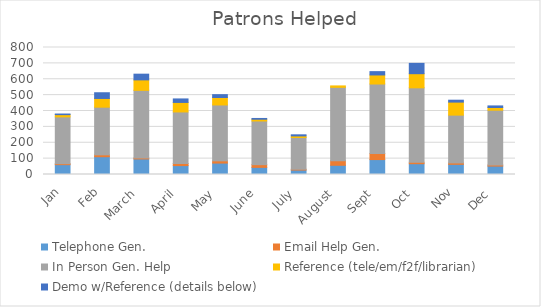
| Category | Telephone Gen. | Email Help Gen. | In Person Gen. Help | Reference (tele/em/f2f/librarian) | Demo w/Reference (details below)  |
|---|---|---|---|---|---|
| Jan | 62 | 6 | 295 | 14 | 4 |
| Feb | 112 | 12 | 300 | 55 | 36 |
| March  | 98 | 6 | 426 | 66 | 36 |
| April  | 56 | 13 | 325 | 60 | 22 |
| May  | 72 | 14 | 352 | 47 | 18 |
| June  | 45 | 17 | 275 | 11 | 5 |
| July  | 28 | 5 | 200 | 10 | 7 |
| August  | 58 | 29 | 462 | 9 | 0 |
| Sept  | 94 | 38 | 438 | 57 | 21 |
| Oct  | 68 | 9 | 469 | 89 | 65 |
| Nov | 64 | 9 | 301 | 82 | 12 |
| Dec  | 53 | 7 | 345 | 17 | 10 |